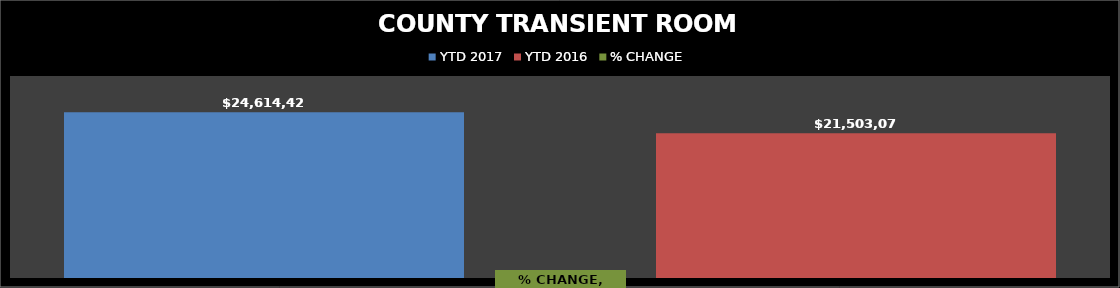
| Category | YTD 2017 | YTD 2016 |
|---|---|---|
| Restaurant Tax Distribution - 2017 | 24614428.64 | 21503076.13 |